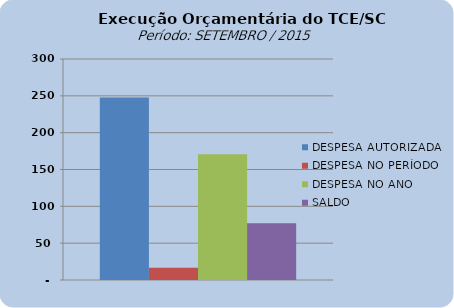
| Category | DESPESA AUTORIZADA | DESPESA NO PERÍODO | DESPESA NO ANO | SALDO |
|---|---|---|---|---|
| 0 | 247590961.98 | 16705794.97 | 170584838.66 | 77006123.32 |